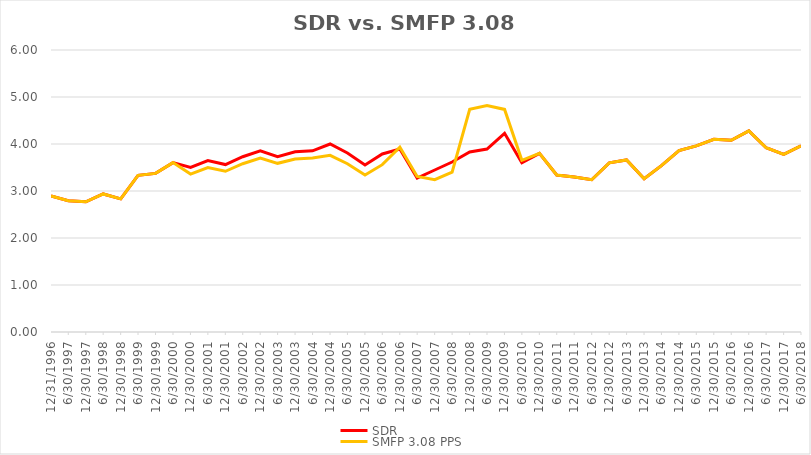
| Category | SDR | SMFP 3.08 PPS |
|---|---|---|
| 12/31/96 | 2.896 | 2.896 |
| 6/30/97 | 2.792 | 2.792 |
| 12/31/97 | 2.771 | 2.771 |
| 6/30/98 | 2.938 | 2.938 |
| 12/31/98 | 2.833 | 2.833 |
| 6/30/99 | 3.333 | 3.333 |
| 12/31/99 | 3.375 | 3.375 |
| 6/30/00 | 3.604 | 3.604 |
| 12/31/00 | 3.5 | 3.36 |
| 6/30/01 | 3.646 | 3.5 |
| 12/31/01 | 3.562 | 3.42 |
| 6/30/02 | 3.729 | 3.58 |
| 12/31/02 | 3.854 | 3.7 |
| 6/30/03 | 3.729 | 3.589 |
| 12/31/03 | 3.833 | 3.68 |
| 6/30/04 | 3.854 | 3.7 |
| 12/31/04 | 4 | 3.76 |
| 6/30/05 | 3.809 | 3.58 |
| 12/31/05 | 3.553 | 3.34 |
| 6/30/06 | 3.787 | 3.56 |
| 12/31/06 | 3.894 | 3.932 |
| 6/30/07 | 3.277 | 3.309 |
| 12/31/07 | 3.447 | 3.24 |
| 6/30/08 | 3.617 | 3.4 |
| 12/31/08 | 3.83 | 4.737 |
| 6/30/09 | 3.894 | 4.816 |
| 12/31/09 | 4.227 | 4.736 |
| 6/30/10 | 3.6 | 3.653 |
| 12/31/10 | 3.8 | 3.8 |
| 6/30/11 | 3.34 | 3.34 |
| 12/31/11 | 3.3 | 3.3 |
| 6/30/12 | 3.24 | 3.24 |
| 12/31/12 | 3.6 | 3.6 |
| 6/30/13 | 3.66 | 3.66 |
| 12/31/13 | 3.26 | 3.26 |
| 6/30/14 | 3.54 | 3.54 |
| 12/31/14 | 3.86 | 3.86 |
| 6/30/15 | 3.96 | 3.96 |
| 12/31/15 | 4.1 | 4.1 |
| 6/30/16 | 4.08 | 4.08 |
| 12/31/16 | 4.28 | 4.28 |
| 6/30/17 | 3.92 | 3.92 |
| 12/31/17 | 3.78 | 3.78 |
| 6/30/18 | 3.96 | 3.96 |